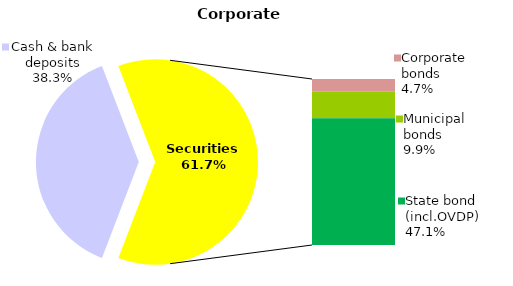
| Category | Corporate |
|---|---|
| Cash & bank deposits | 116.85 |
| Bank metals | 0 |
| Real estate | 0 |
| Other assets | 0 |
| Equities | 0.022 |
| Corporate bonds | 14.298 |
| Municipal bonds | 30.173 |
| State bond (incl.OVDP) | 143.515 |